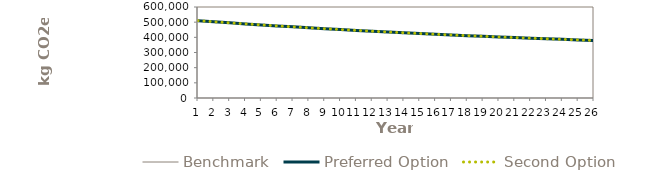
| Category | Benchmark | Preferred Option | Second Option |
|---|---|---|---|
| 0 | 509993.97 | 509993.97 | 509993.97 |
| 1 | 502657.63 | 502657.63 | 502657.63 |
| 2 | 495541.38 | 495541.38 | 495541.38 |
| 3 | 488638.618 | 488638.618 | 488638.618 |
| 4 | 481942.938 | 481942.938 | 481942.938 |
| 5 | 475448.129 | 475448.129 | 475448.129 |
| 6 | 469148.164 | 469148.164 | 469148.164 |
| 7 | 463037.198 | 463037.198 | 463037.198 |
| 8 | 457109.561 | 457109.561 | 457109.561 |
| 9 | 451359.753 | 451359.753 | 451359.753 |
| 10 | 445782.439 | 445782.439 | 445782.439 |
| 11 | 440372.445 | 440372.445 | 440372.445 |
| 12 | 435124.751 | 435124.751 | 435124.751 |
| 13 | 430034.487 | 430034.487 | 430034.487 |
| 14 | 425096.931 | 425096.931 | 425096.931 |
| 15 | 420307.502 | 420307.502 | 420307.502 |
| 16 | 415661.756 | 415661.756 | 415661.756 |
| 17 | 411155.382 | 411155.382 | 411155.382 |
| 18 | 406784.2 | 406784.2 | 406784.2 |
| 19 | 402544.153 | 402544.153 | 402544.153 |
| 20 | 398431.307 | 398431.307 | 398431.307 |
| 21 | 394441.847 | 394441.847 | 394441.847 |
| 22 | 390572.07 | 390572.07 | 390572.07 |
| 23 | 386818.387 | 386818.387 | 386818.387 |
| 24 | 383177.314 | 383177.314 | 383177.314 |
| 25 | 379645.474 | 379645.474 | 379645.474 |